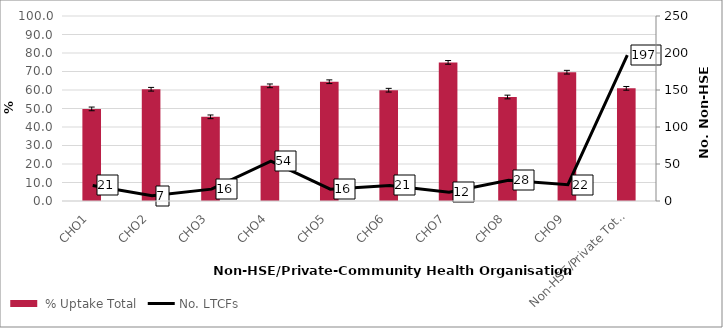
| Category |  % Uptake Total |
|---|---|
| CHO1 | 49.784 |
| CHO2 | 60.404 |
| CHO3 | 45.503 |
| CHO4 | 62.254 |
| CHO5 | 64.469 |
| CHO6 | 59.893 |
| CHO7 | 74.927 |
| CHO8 | 56.219 |
| CHO9 | 69.619 |
| Non-HSE/Private Total | 60.896 |